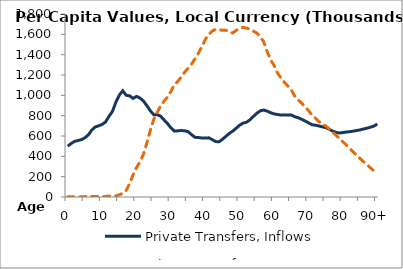
| Category | Private Transfers, Inflows | Private Transfers, Outflows |
|---|---|---|
| 0 | 500068.33 | 1797.066 |
|  | 526375.13 | 2260.846 |
| 2 | 547134.62 | 1734.487 |
| 3 | 555348.82 | 898.493 |
| 4 | 564273.25 | 1732.709 |
| 5 | 582874.43 | 3906.408 |
| 6 | 610953.86 | 5564.991 |
| 7 | 658681.55 | 6058.079 |
| 8 | 689137.69 | 5120.858 |
| 9 | 700520.65 | 3824.643 |
| 10 | 713695.89 | 4157.273 |
| 11 | 737914.44 | 5808.778 |
| 12 | 793717.437 | 8701.395 |
| 13 | 841843.38 | 9166.265 |
| 14 | 932076.03 | 10375.104 |
| 15 | 1002066.52 | 21409.24 |
| 16 | 1045414.7 | 36658.832 |
| 17 | 1000529.002 | 64788.231 |
| 18 | 995355.962 | 132886.087 |
| 19 | 969380.158 | 217749.298 |
| 20 | 989700.165 | 288952.889 |
| 21 | 973656.981 | 345511.637 |
| 22 | 944728.73 | 420294.542 |
| 23 | 899031.459 | 530393.248 |
| 24 | 848467.26 | 651816.854 |
| 25 | 809971.636 | 763615.12 |
| 26 | 809530.312 | 831793.82 |
| 27 | 795151.75 | 894225.314 |
| 28 | 758795.47 | 942558.547 |
| 29 | 722292.062 | 981672.365 |
| 30 | 680753.066 | 1038075.529 |
| 31 | 647768.46 | 1103271.726 |
| 32 | 650883.525 | 1137153.152 |
| 33 | 653760.476 | 1179855.618 |
| 34 | 650985.111 | 1228644.472 |
| 35 | 642679.904 | 1265431.878 |
| 36 | 613363.772 | 1306701.49 |
| 37 | 586777.172 | 1359137.647 |
| 38 | 585199.654 | 1414743.412 |
| 39 | 579944.581 | 1480067.829 |
| 40 | 580210.3 | 1549394.154 |
| 41 | 581822.788 | 1599152.558 |
| 42 | 564599.4 | 1631241.964 |
| 43 | 545203.151 | 1648978.261 |
| 44 | 542938.807 | 1643721.185 |
| 45 | 568102.299 | 1640512.501 |
| 46 | 597076.197 | 1640945.953 |
| 47 | 625603.036 | 1618534.915 |
| 48 | 648402.845 | 1613776.993 |
| 49 | 677390.354 | 1639507.313 |
| 50 | 706647.91 | 1661020.619 |
| 51 | 727283.32 | 1668184.993 |
| 52 | 735818.3 | 1660930.919 |
| 53 | 759548.53 | 1651371.48 |
| 54 | 793064.61 | 1630573.045 |
| 55 | 823758.6 | 1611497.318 |
| 56 | 847813 | 1576097.153 |
| 57 | 855439.09 | 1525081.713 |
| 58 | 844448.95 | 1429450.678 |
| 59 | 829085.88 | 1348974.932 |
| 60 | 817180.8 | 1292827.389 |
| 61 | 811740.44 | 1219012.455 |
| 62 | 805352.03 | 1171372.191 |
| 63 | 807827.55 | 1127763.115 |
| 64 | 807173.59 | 1091200.878 |
| 65 | 807457.81 | 1054815.212 |
| 66 | 789573.82 | 992374.734 |
| 67 | 780312.21 | 955077.112 |
| 68 | 765047.82 | 924198.467 |
| 69 | 748338.85 | 887764.186 |
| 70 | 730070.07 | 849654.705 |
| 71 | 711307.93 | 806439.365 |
| 72 | 706301.4 | 776117.039 |
| 73 | 698818.89 | 741733.141 |
| 74 | 690372.08 | 720971.382 |
| 75 | 682294.09 | 698137.048 |
| 76 | 667239.98 | 671093.808 |
| 77 | 647990.04 | 637703.198 |
| 78 | 635883.79 | 607980.821 |
| 79 | 629171.7 | 575187.329 |
| 80 | 634401.04 | 543082.177 |
| 81 | 639166.41 | 510186.234 |
| 82 | 642487.77 | 476439.221 |
| 83 | 647766.91 | 443232.125 |
| 84 | 654042.28 | 410418.134 |
| 85 | 659883.19 | 377962.992 |
| 86 | 668906.94 | 347548.174 |
| 87 | 677153.61 | 317567.32 |
| 88 | 686624.443 | 287167.435 |
| 89 | 697152.916 | 257077.555 |
| 90+ | 717933.198 | 230123.718 |